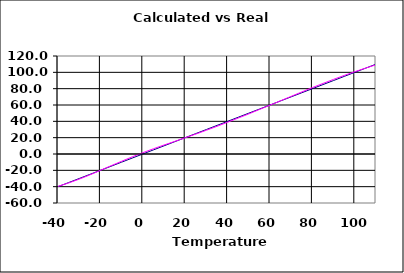
| Category | Temperature | calculated value |
|---|---|---|
| -40.0 | -40 | -39.6 |
| -35.0 | -35 | -35.5 |
| -30.0 | -30 | -30.8 |
| -25.0 | -25 | -25.6 |
| -20.0 | -20 | -20 |
| -15.0 | -15 | -14.4 |
| -10.0 | -10 | -8.9 |
| -5.0 | -5 | -3.5 |
| 0.0 | 0 | 1.6 |
| 5.0 | 5 | 6.4 |
| 10.0 | 10 | 11 |
| 15.0 | 15 | 15.4 |
| 20.0 | 20 | 19.9 |
| 25.0 | 25 | 24.4 |
| 30.0 | 30 | 29.1 |
| 35.0 | 35 | 33.9 |
| 40.0 | 40 | 38.9 |
| 45.0 | 45 | 44 |
| 50.0 | 50 | 49.1 |
| 55.0 | 55 | 54.5 |
| 60.0 | 60 | 59.8 |
| 65.0 | 65 | 65.2 |
| 70.0 | 70 | 70.6 |
| 75.0 | 75 | 76 |
| 80.0 | 80 | 81.3 |
| 85.0 | 85 | 86.4 |
| 90.0 | 90 | 91.4 |
| 95.0 | 95 | 96.2 |
| 100.0 | 100 | 100.8 |
| 105.0 | 105 | 105.1 |
| 110.0 | 110 | 109.2 |